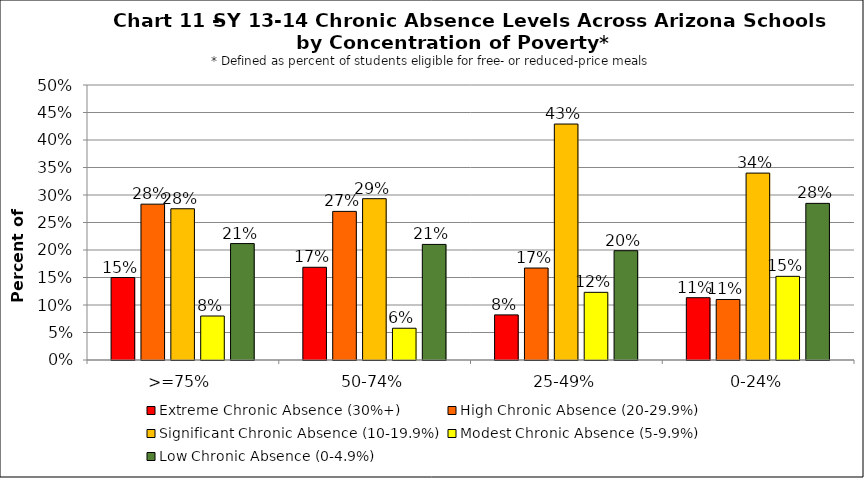
| Category | Extreme Chronic Absence (30%+) | High Chronic Absence (20-29.9%) | Significant Chronic Absence (10-19.9%) | Modest Chronic Absence (5-9.9%) | Low Chronic Absence (0-4.9%) |
|---|---|---|---|---|---|
| 0 | 0.15 | 0.283 | 0.275 | 0.08 | 0.212 |
| 1 | 0.169 | 0.27 | 0.293 | 0.058 | 0.21 |
| 2 | 0.082 | 0.167 | 0.429 | 0.123 | 0.199 |
| 3 | 0.113 | 0.11 | 0.34 | 0.152 | 0.285 |